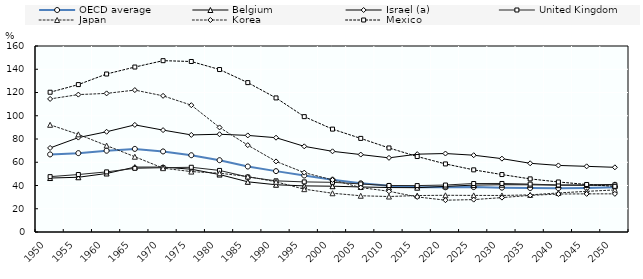
| Category | OECD average | Belgium | Israel (a) | United Kingdom | Japan | Korea | Mexico |
|---|---|---|---|---|---|---|---|
| 1950.0 | 66.758 | 46.415 | 72.313 | 47.611 | 92.209 | 114.466 | 120.227 |
| 1955.0 | 67.848 | 47.088 | 81.223 | 49.443 | 83.986 | 118.195 | 126.803 |
| 1960.0 | 69.923 | 50.325 | 86.228 | 51.707 | 74.341 | 119.235 | 135.912 |
| 1965.0 | 71.487 | 55.819 | 92.144 | 54.782 | 64.746 | 122.075 | 141.896 |
| 1970.0 | 69.306 | 55.83 | 87.639 | 55.301 | 54.924 | 117.132 | 147.383 |
| 1975.0 | 66.046 | 53.992 | 83.52 | 55.675 | 51.951 | 109.099 | 146.669 |
| 1980.0 | 61.787 | 49.419 | 84.076 | 52.963 | 50.577 | 89.957 | 139.754 |
| 1985.0 | 56.33 | 43.165 | 83.081 | 47.318 | 47.718 | 74.709 | 128.508 |
| 1990.0 | 52.37 | 40.635 | 81.118 | 43.998 | 43.18 | 60.722 | 115.346 |
| 1995.0 | 48.597 | 39.671 | 73.678 | 43.102 | 36.851 | 51.076 | 99.24 |
| 2000.0 | 45.008 | 39.386 | 69.4 | 42.738 | 33.33 | 44.808 | 88.5 |
| 2005.0 | 41.884 | 38.739 | 66.611 | 41.322 | 31.179 | 38.229 | 80.511 |
| 2010.0 | 39.702 | 38.247 | 63.783 | 40.008 | 30.51 | 35.023 | 72.296 |
| 2015.0 | 38.592 | 38.117 | 66.95 | 39.929 | 31.363 | 30.169 | 64.928 |
| 2020.0 | 38.478 | 39.229 | 67.507 | 40.396 | 31.585 | 27.368 | 58.549 |
| 2025.0 | 38.621 | 40.342 | 66.058 | 41.7 | 31.473 | 27.859 | 53.461 |
| 2030.0 | 38.145 | 40.664 | 63.101 | 41.741 | 31.433 | 29.576 | 49.409 |
| 2035.0 | 37.825 | 40.606 | 59.112 | 41.202 | 31.914 | 31.505 | 45.686 |
| 2040.0 | 37.726 | 40.332 | 57.268 | 40.422 | 33.595 | 32.657 | 43.035 |
| 2045.0 | 37.927 | 40.419 | 56.482 | 40.097 | 34.986 | 32.807 | 40.882 |
| 2050.0 | 38.444 | 40.963 | 55.632 | 40.585 | 36.15 | 32.817 | 39.261 |